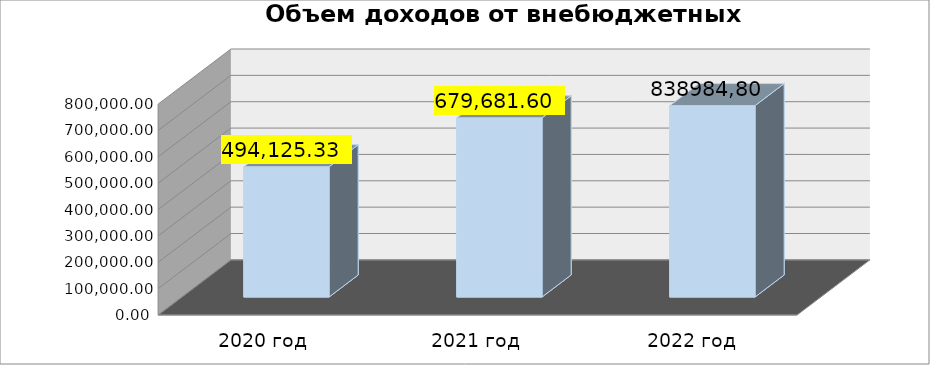
| Category | Series 0 |
|---|---|
| 2020 год | 494125.33 |
| 2021 год | 679681.6 |
|  2022 год | 726059.11 |